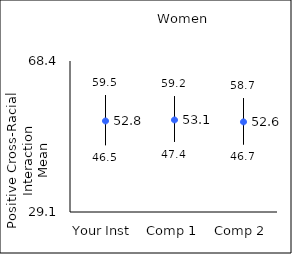
| Category | 25th percentile | 75th percentile | Mean |
|---|---|---|---|
| Your Inst | 46.5 | 59.5 | 52.79 |
| Comp 1 | 47.4 | 59.2 | 53.06 |
| Comp 2 | 46.7 | 58.7 | 52.55 |